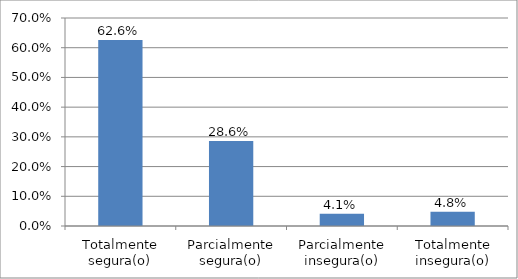
| Category | Series 0 |
|---|---|
| Totalmente segura(o) | 0.626 |
| Parcialmente segura(o) | 0.286 |
| Parcialmente insegura(o) | 0.041 |
| Totalmente insegura(o) | 0.048 |